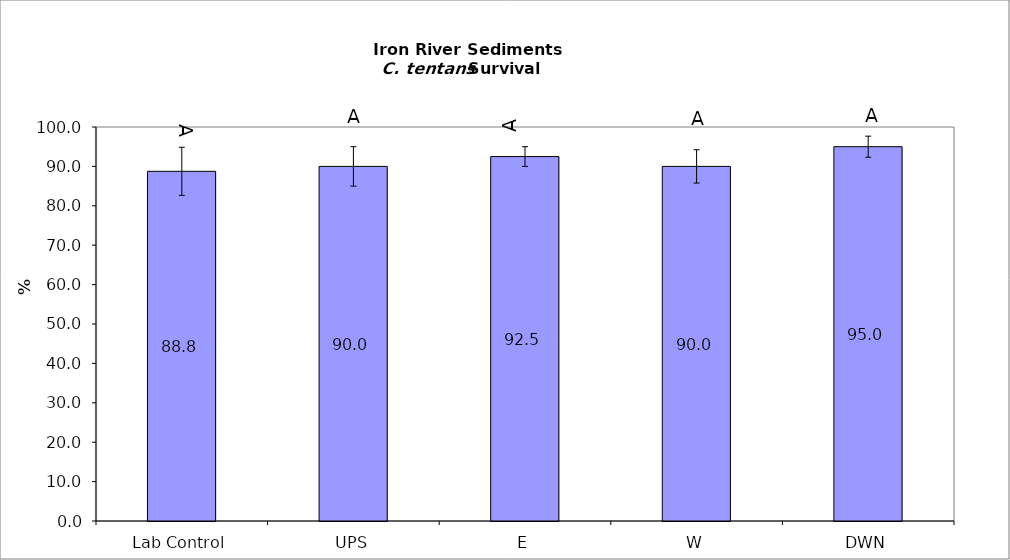
| Category | 6.1 5.0 2.5 4.2 2.7 |
|---|---|
| Lab Control | 88.75 |
| UPS | 90 |
| E | 92.5 |
| W | 90 |
| DWN | 95 |